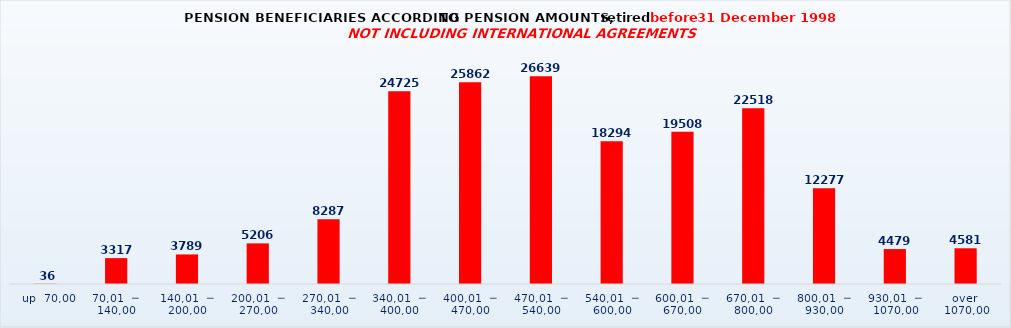
| Category | Series 0 |
|---|---|
|   up  70,00 | 36 |
| 70,01  ─  140,00 | 3317 |
| 140,01  ─  200,00 | 3789 |
| 200,01  ─  270,00 | 5206 |
| 270,01  ─  340,00 | 8287 |
| 340,01  ─  400,00 | 24725 |
| 400,01  ─  470,00 | 25862 |
| 470,01  ─  540,00 | 26639 |
| 540,01  ─  600,00 | 18294 |
| 600,01  ─  670,00 | 19508 |
| 670,01  ─  800,00 | 22518 |
| 800,01  ─  930,00 | 12277 |
| 930,01  ─  1070,00 | 4479 |
| over  1070,00 | 4581 |